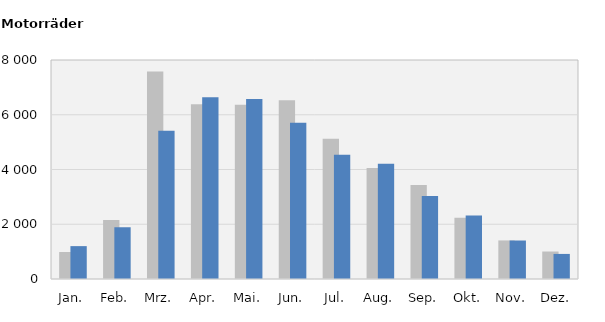
| Category | 2017 | 2018 |
|---|---|---|
| Jan. | 986 | 1201 |
| Feb. | 2158 | 1887 |
| Mrz. | 7581 | 5418 |
| Apr. | 6380 | 6639 |
| Mai. | 6363 | 6579 |
| Jun. | 6529 | 5705 |
| Jul. | 5119 | 4543 |
| Aug. | 4056 | 4210 |
| Sep. | 3432 | 3029 |
| Okt. | 2238 | 2322 |
| Nov. | 1409 | 1406 |
| Dez. | 1004 | 916 |